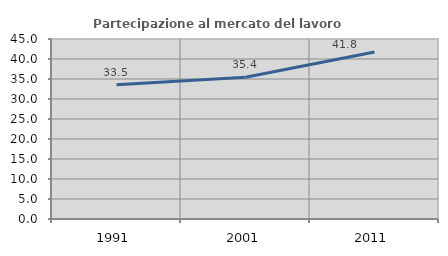
| Category | Partecipazione al mercato del lavoro  femminile |
|---|---|
| 1991.0 | 33.536 |
| 2001.0 | 35.42 |
| 2011.0 | 41.764 |